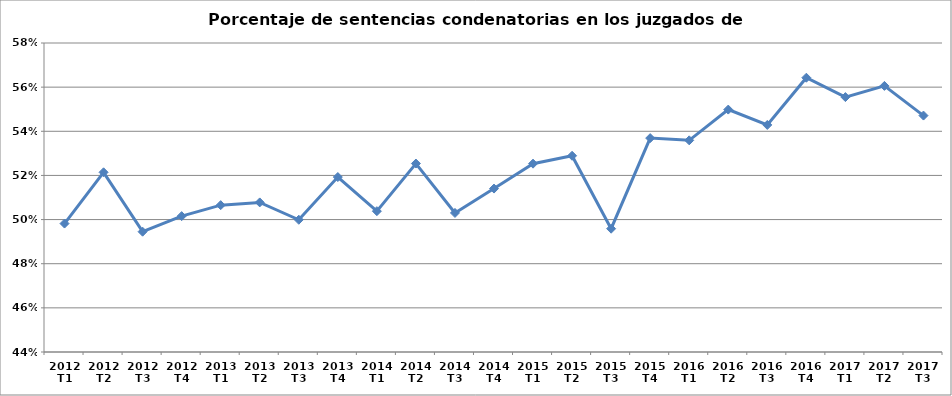
| Category | j penal % condenas |
|---|---|
| 2012 T1 | 0.498 |
| 2012 T2 | 0.521 |
| 2012 T3 | 0.495 |
| 2012 T4 | 0.502 |
| 2013 T1 | 0.507 |
| 2013 T2 | 0.508 |
| 2013 T3 | 0.5 |
| 2013 T4 | 0.519 |
| 2014 T1 | 0.504 |
| 2014 T2 | 0.525 |
| 2014 T3 | 0.503 |
| 2014 T4 | 0.514 |
| 2015 T1 | 0.525 |
| 2015 T2 | 0.529 |
| 2015 T3 | 0.496 |
| 2015 T4 | 0.537 |
| 2016 T1 | 0.536 |
| 2016 T2 | 0.55 |
| 2016 T3 | 0.543 |
| 2016 T4 | 0.564 |
| 2017 T1 | 0.555 |
| 2017 T2 | 0.561 |
| 2017 T3 | 0.547 |